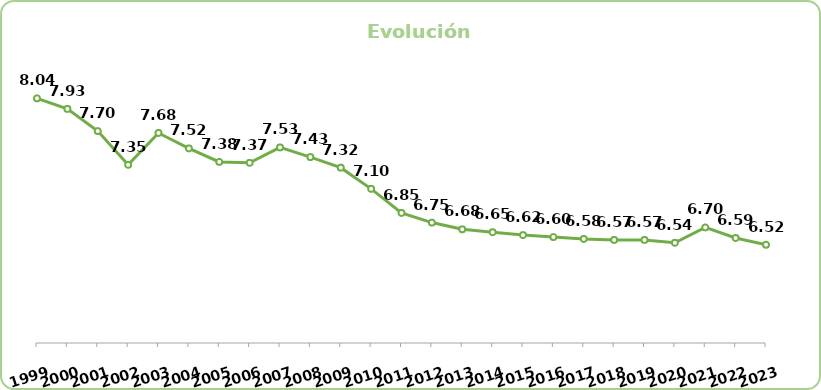
| Category | Series 0 |
|---|---|
| 1999.0 | 8.04 |
| 2000.0 | 7.93 |
| 2001.0 | 7.7 |
| 2002.0 | 7.35 |
| 2003.0 | 7.68 |
| 2004.0 | 7.52 |
| 2005.0 | 7.38 |
| 2006.0 | 7.37 |
| 2007.0 | 7.53 |
| 2008.0 | 7.43 |
| 2009.0 | 7.32 |
| 2010.0 | 7.1 |
| 2011.0 | 6.85 |
| 2012.0 | 6.75 |
| 2013.0 | 6.68 |
| 2014.0 | 6.65 |
| 2015.0 | 6.62 |
| 2016.0 | 6.6 |
| 2017.0 | 6.58 |
| 2018.0 | 6.57 |
| 2019.0 | 6.57 |
| 2020.0 | 6.54 |
| 2021.0 | 6.7 |
| 2022.0 | 6.59 |
| 2023.0 | 6.52 |